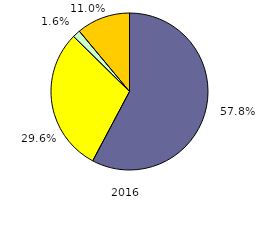
| Category | 2016 |
|---|---|
| 0 | 57.763 |
| 1 | 29.613 |
| 2 | 1.58 |
| 3 | 11.045 |